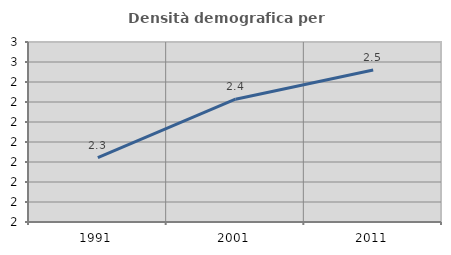
| Category | Densità demografica |
|---|---|
| 1991.0 | 2.261 |
| 2001.0 | 2.407 |
| 2011.0 | 2.48 |